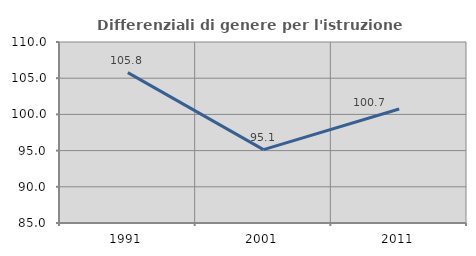
| Category | Differenziali di genere per l'istruzione superiore |
|---|---|
| 1991.0 | 105.771 |
| 2001.0 | 95.133 |
| 2011.0 | 100.742 |